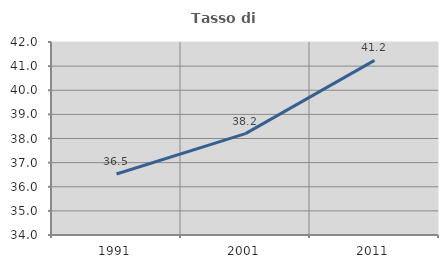
| Category | Tasso di occupazione   |
|---|---|
| 1991.0 | 36.53 |
| 2001.0 | 38.2 |
| 2011.0 | 41.236 |